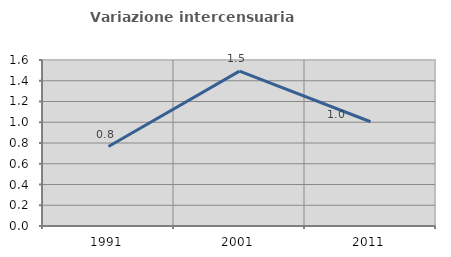
| Category | Variazione intercensuaria annua |
|---|---|
| 1991.0 | 0.766 |
| 2001.0 | 1.493 |
| 2011.0 | 1.005 |